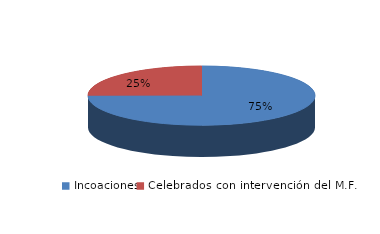
| Category | Series 0 |
|---|---|
| Incoaciones | 11149 |
| Celebrados con intervención del M.F. | 3721 |